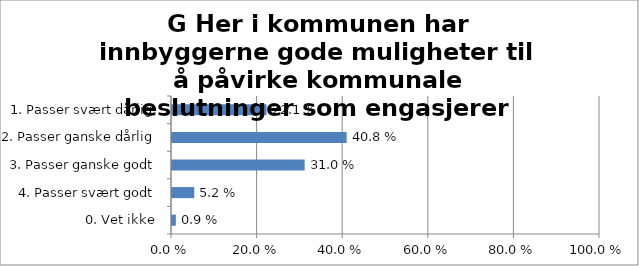
| Category | G Her i kommunen har innbyggerne gode muligheter til å påvirke kommunale beslutninger som engasjerer dem. |
|---|---|
| 1. Passer svært dårlig | 0.221 |
| 2. Passer ganske dårlig | 0.408 |
| 3. Passer ganske godt | 0.31 |
| 4. Passer svært godt | 0.052 |
| 0. Vet ikke | 0.009 |